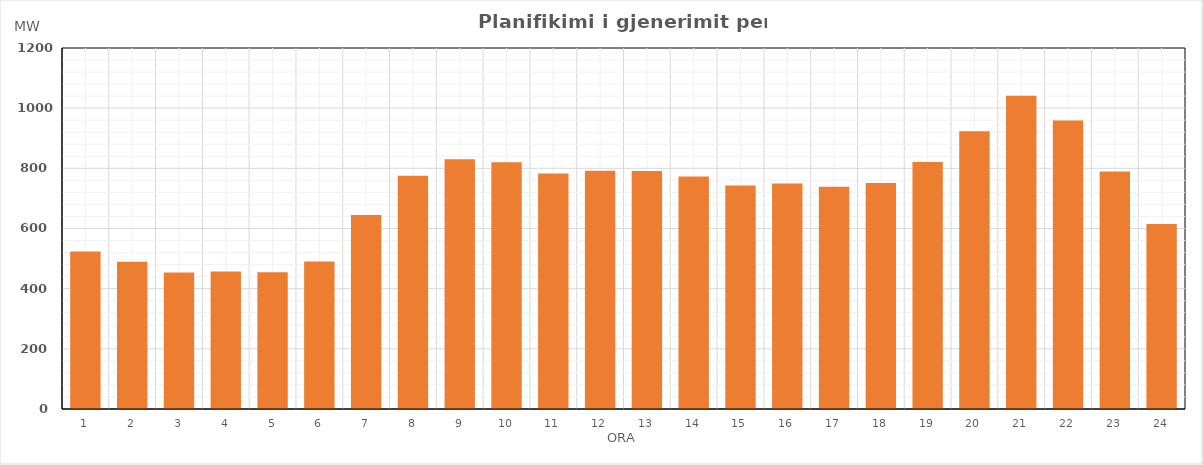
| Category | Max (MW) |
|---|---|
| 0 | 523.35 |
| 1 | 489.34 |
| 2 | 453.81 |
| 3 | 456.96 |
| 4 | 454.2 |
| 5 | 490.25 |
| 6 | 644.8 |
| 7 | 775.29 |
| 8 | 829.91 |
| 9 | 820.49 |
| 10 | 782.48 |
| 11 | 791.69 |
| 12 | 790.8 |
| 13 | 772.5 |
| 14 | 742.71 |
| 15 | 749.98 |
| 16 | 738.56 |
| 17 | 751.44 |
| 18 | 820.95 |
| 19 | 923.66 |
| 20 | 1041.21 |
| 21 | 959.22 |
| 22 | 789.07 |
| 23 | 615.1 |